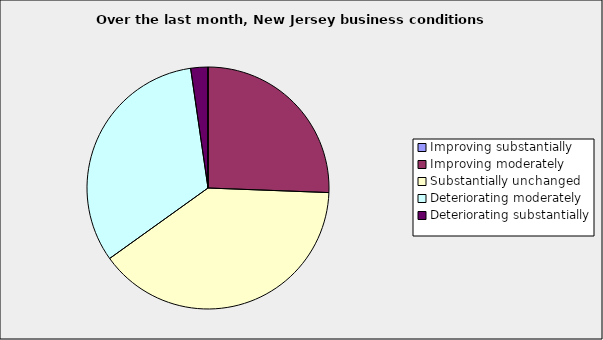
| Category | Series 0 |
|---|---|
| Improving substantially | 0 |
| Improving moderately | 0.256 |
| Substantially unchanged | 0.395 |
| Deteriorating moderately | 0.326 |
| Deteriorating substantially | 0.023 |